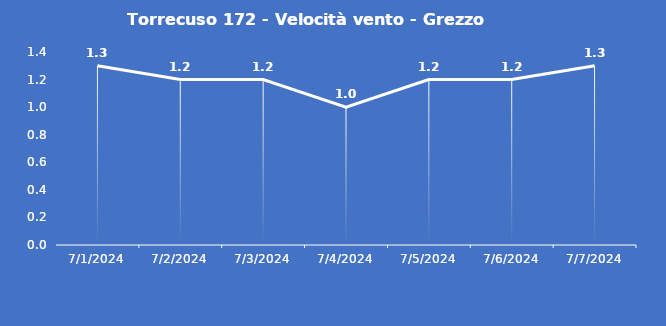
| Category | Torrecuso 172 - Velocità vento - Grezzo (m/s) |
|---|---|
| 7/1/24 | 1.3 |
| 7/2/24 | 1.2 |
| 7/3/24 | 1.2 |
| 7/4/24 | 1 |
| 7/5/24 | 1.2 |
| 7/6/24 | 1.2 |
| 7/7/24 | 1.3 |